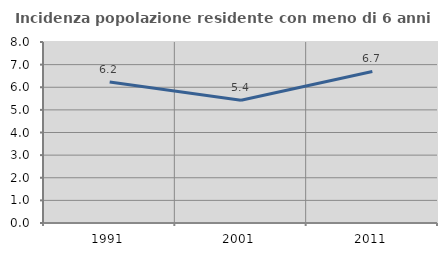
| Category | Incidenza popolazione residente con meno di 6 anni |
|---|---|
| 1991.0 | 6.231 |
| 2001.0 | 5.428 |
| 2011.0 | 6.697 |